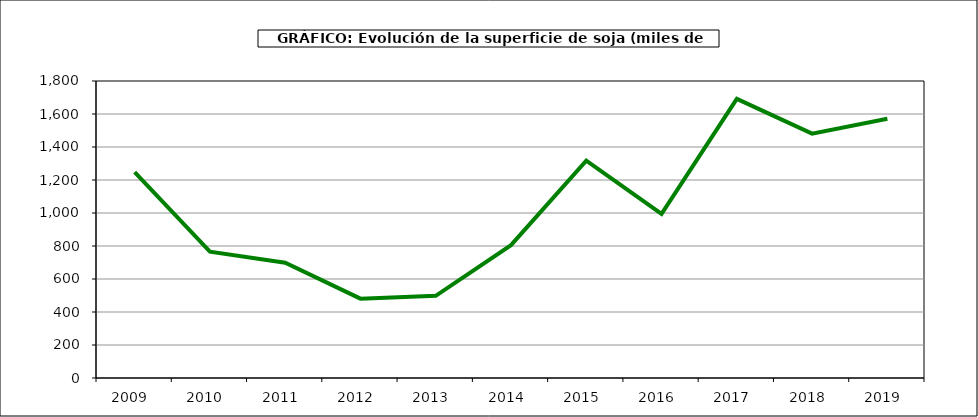
| Category | Superficie |
|---|---|
| 2009.0 | 1247 |
| 2010.0 | 766 |
| 2011.0 | 699 |
| 2012.0 | 481 |
| 2013.0 | 498 |
| 2014.0 | 805 |
| 2015.0 | 1317 |
| 2016.0 | 995 |
| 2017.0 | 1692 |
| 2018.0 | 1481 |
| 2019.0 | 1571 |